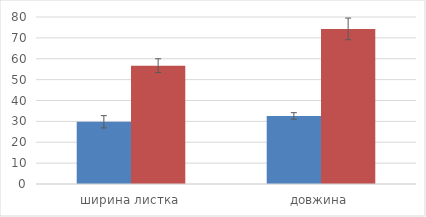
| Category | ширина листка | довжина |
|---|---|---|
| ширина листка | 29.8 | 56.7 |
| довжина | 32.6 | 74.3 |